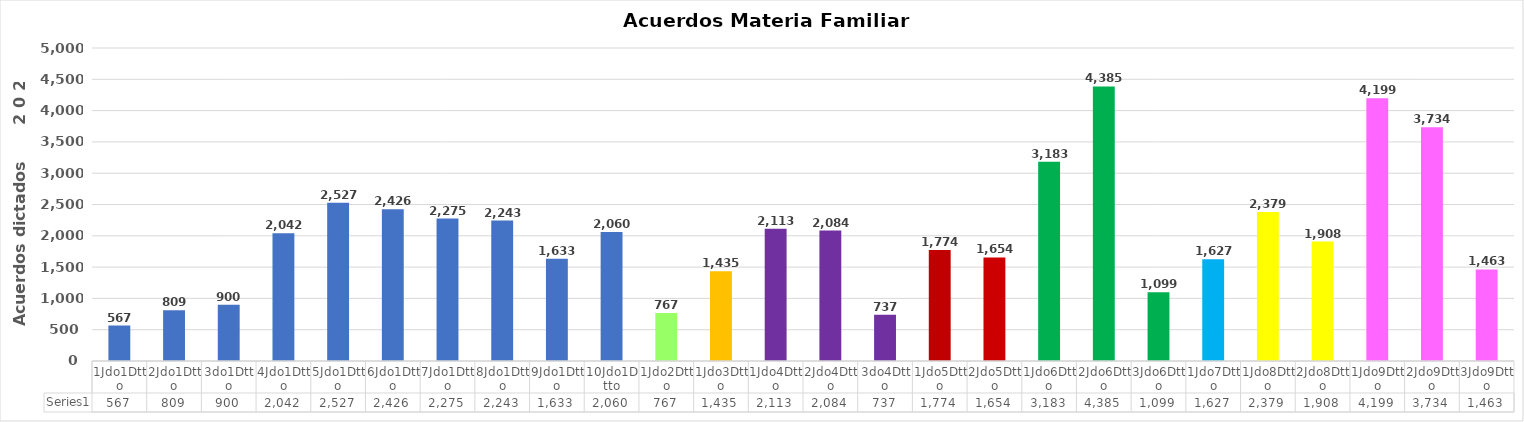
| Category | Series 0 |
|---|---|
| 1Jdo1Dtto | 567 |
| 2Jdo1Dtto | 809 |
| 3do1Dtto | 900 |
| 4Jdo1Dtto | 2042 |
| 5Jdo1Dtto | 2527 |
| 6Jdo1Dtto | 2426 |
| 7Jdo1Dtto | 2275 |
| 8Jdo1Dtto | 2243 |
| 9Jdo1Dtto | 1633 |
| 10Jdo1Dtto | 2060 |
| 1Jdo2Dtto | 767 |
| 1Jdo3Dtto | 1435 |
| 1Jdo4Dtto | 2113 |
| 2Jdo4Dtto | 2084 |
| 3do4Dtto | 737 |
| 1Jdo5Dtto | 1774 |
| 2Jdo5Dtto | 1654 |
| 1Jdo6Dtto | 3183 |
| 2Jdo6Dtto | 4385 |
| 3Jdo6Dtto | 1099 |
| 1Jdo7Dtto | 1627 |
| 1Jdo8Dtto | 2379 |
| 2Jdo8Dtto | 1908 |
| 1Jdo9Dtto | 4199 |
| 2Jdo9Dtto | 3734 |
| 3Jdo9Dtto | 1463 |